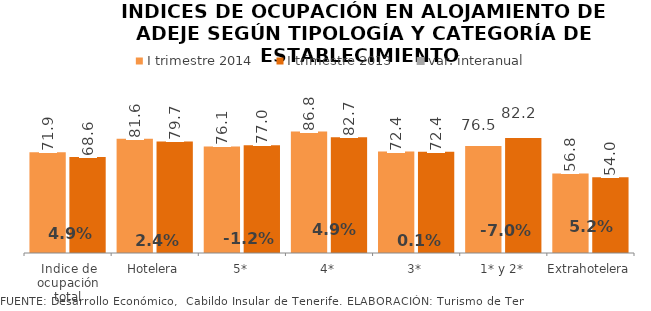
| Category | I trimestre 2014 | I trimestre 2013 |
|---|---|---|
| Indice de ocupación total | 71.926 | 68.593 |
| Hotelera | 81.586 | 79.67 |
| 5* | 76.072 | 76.97 |
| 4* | 86.785 | 82.741 |
| 3* | 72.417 | 72.381 |
| 1* y 2* | 76.487 | 82.228 |
| Extrahotelera | 56.847 | 54.031 |